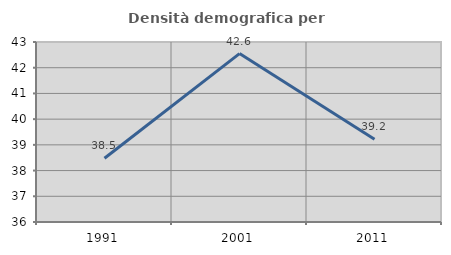
| Category | Densità demografica |
|---|---|
| 1991.0 | 38.48 |
| 2001.0 | 42.55 |
| 2011.0 | 39.22 |